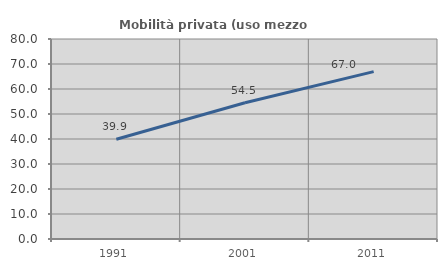
| Category | Mobilità privata (uso mezzo privato) |
|---|---|
| 1991.0 | 39.881 |
| 2001.0 | 54.494 |
| 2011.0 | 66.952 |